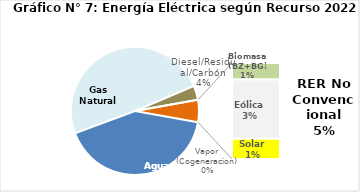
| Category | Series 0 |
|---|---|
| Agua | 2072.217 |
| Gas Natural | 2457.031 |
| Diesel/Residual/Carbón | 178.434 |
| Vapor (Cogeneracion) | 0.107 |
| Biomasa (BZ+BG) | 48.48 |
| Eólica | 172.722 |
| Solar | 58.952 |